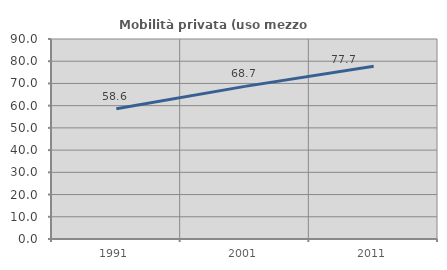
| Category | Mobilità privata (uso mezzo privato) |
|---|---|
| 1991.0 | 58.612 |
| 2001.0 | 68.675 |
| 2011.0 | 77.696 |